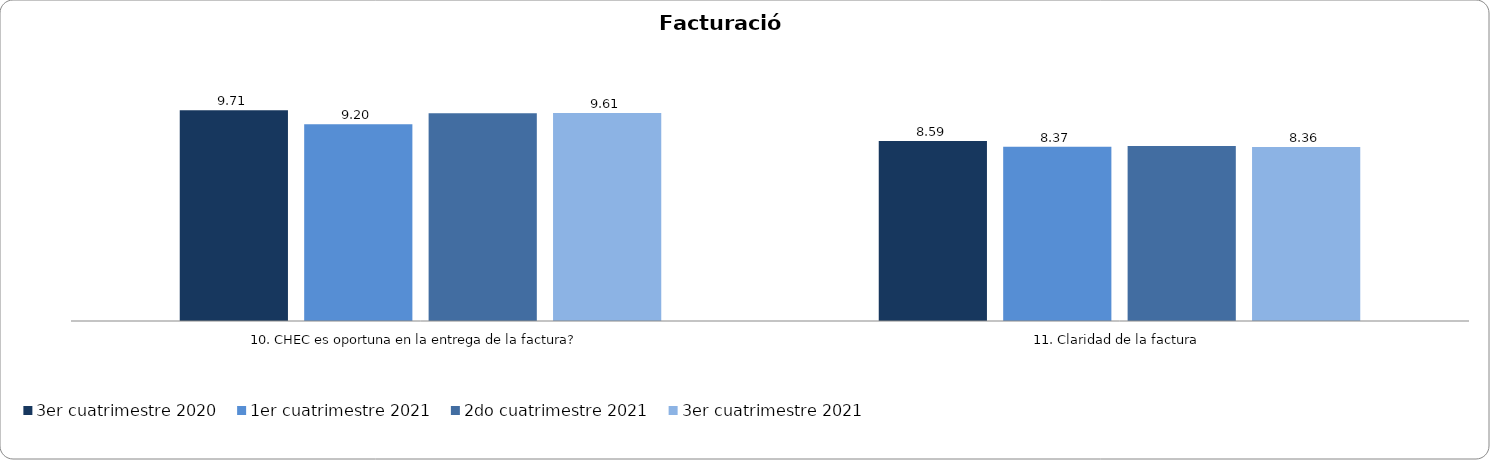
| Category | 3er cuatrimestre 2020 | 1er cuatrimestre 2021 | 1er cuatrimestre 2019 | 2do cuatrimestre 2019 | 2do cuatrimestre 2021 | 3er cuatrimestre 2021 |
|---|---|---|---|---|---|---|
| 10. CHEC es oportuna en la entrega de la factura? | 9.706 | 9.198 |  |  | 9.599 | 9.609 |
| 11. Claridad de la factura | 8.589 | 8.374 |  |  | 8.398 | 8.363 |